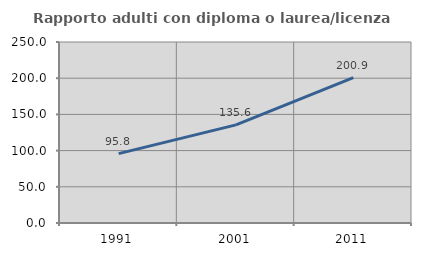
| Category | Rapporto adulti con diploma o laurea/licenza media  |
|---|---|
| 1991.0 | 95.825 |
| 2001.0 | 135.585 |
| 2011.0 | 200.899 |